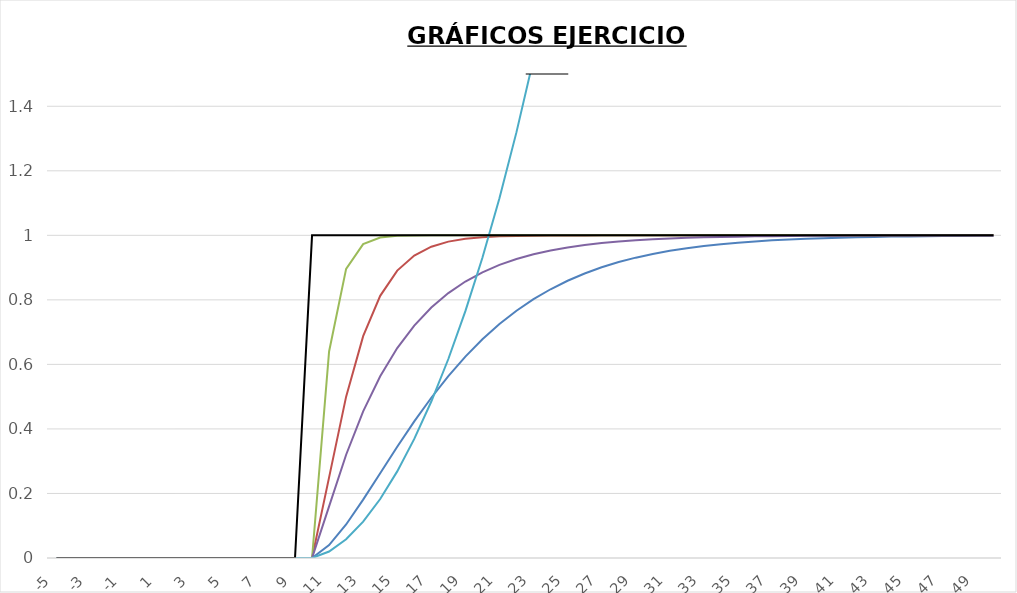
| Category | 1) | 2) | 3) | 4) | 5) | Series 5 |
|---|---|---|---|---|---|---|
| -5.0 | 0 | 0 | 0 | 0 | 0 | 0 |
| -4.0 | 0 | 0 | 0 | 0 | 0 | 0 |
| -3.0 | 0 | 0 | 0 | 0 | 0 | 0 |
| -2.0 | 0 | 0 | 0 | 0 | 0 | 0 |
| -1.0 | 0 | 0 | 0 | 0 | 0 | 0 |
| 0.0 | 0 | 0 | 0 | 0 | 0 | 0 |
| 1.0 | 0 | 0 | 0 | 0 | 0 | 0 |
| 2.0 | 0 | 0 | 0 | 0 | 0 | 0 |
| 3.0 | 0 | 0 | 0 | 0 | 0 | 0 |
| 4.0 | 0 | 0 | 0 | 0 | 0 | 0 |
| 5.0 | 0 | 0 | 0 | 0 | 0 | 0 |
| 6.0 | 0 | 0 | 0 | 0 | 0 | 0 |
| 7.0 | 0 | 0 | 0 | 0 | 0 | 0 |
| 8.0 | 0 | 0 | 0 | 0 | 0 | 0 |
| 9.0 | 0 | 0 | 0 | 0 | 0 | 0 |
| 10.0 | 0 | 0 | 0 | 0 | 0 | 1 |
| 11.0 | 0.04 | 0.25 | 0.64 | 0.16 | 0.02 | 1 |
| 12.0 | 0.104 | 0.5 | 0.896 | 0.32 | 0.058 | 1 |
| 13.0 | 0.181 | 0.688 | 0.973 | 0.454 | 0.113 | 1 |
| 14.0 | 0.263 | 0.812 | 0.993 | 0.563 | 0.183 | 1 |
| 15.0 | 0.345 | 0.891 | 0.998 | 0.65 | 0.268 | 1 |
| 16.0 | 0.423 | 0.938 | 1 | 0.72 | 0.369 | 1 |
| 17.0 | 0.497 | 0.965 | 1 | 0.776 | 0.485 | 1 |
| 18.0 | 0.564 | 0.98 | 1 | 0.821 | 0.617 | 1 |
| 19.0 | 0.624 | 0.989 | 1 | 0.857 | 0.765 | 1 |
| 20.0 | 0.678 | 0.994 | 1 | 0.885 | 0.931 | 1 |
| 21.0 | 0.725 | 0.997 | 1 | 0.908 | 1.115 | 1 |
| 22.0 | 0.766 | 0.998 | 1 | 0.927 | 1.32 | 1 |
| 23.0 | 0.802 | 0.999 | 1 | 0.941 | 1.546 | 1 |
| 24.0 | 0.833 | 1 | 1 | 0.953 | 1.797 | 1 |
| 25.0 | 0.859 | 1 | 1 | 0.962 | 2.073 | 1 |
| 26.0 | 0.882 | 1 | 1 | 0.97 | 2.377 | 1 |
| 27.0 | 0.901 | 1 | 1 | 0.976 | 2.713 | 1 |
| 28.0 | 0.917 | 1 | 1 | 0.981 | 3.082 | 1 |
| 29.0 | 0.931 | 1 | 1 | 0.985 | 3.489 | 1 |
| 30.0 | 0.942 | 1 | 1 | 0.988 | 3.937 | 1 |
| 31.0 | 0.952 | 1 | 1 | 0.99 | 4.429 | 1 |
| 32.0 | 0.96 | 1 | 1 | 0.992 | 4.972 | 1 |
| 33.0 | 0.967 | 1 | 1 | 0.994 | 5.568 | 1 |
| 34.0 | 0.973 | 1 | 1 | 0.995 | 6.224 | 1 |
| 35.0 | 0.977 | 1 | 1 | 0.996 | 6.946 | 1 |
| 36.0 | 0.981 | 1 | 1 | 0.997 | 7.741 | 1 |
| 37.0 | 0.985 | 1 | 1 | 0.997 | 8.615 | 1 |
| 38.0 | 0.987 | 1 | 1 | 0.998 | 9.576 | 1 |
| 39.0 | 0.989 | 1 | 1 | 0.998 | 10.633 | 1 |
| 40.0 | 0.991 | 1 | 1 | 0.999 | 11.797 | 1 |
| 41.0 | 0.993 | 1 | 1 | 0.999 | 13.076 | 1 |
| 42.0 | 0.994 | 1 | 1 | 0.999 | 14.484 | 1 |
| 43.0 | 0.995 | 1 | 1 | 0.999 | 16.032 | 1 |
| 44.0 | 0.996 | 1 | 1 | 0.999 | 17.735 | 1 |
| 45.0 | 0.997 | 1 | 1 | 1 | 19.609 | 1 |
| 46.0 | 0.997 | 1 | 1 | 1 | 21.669 | 1 |
| 47.0 | 0.998 | 1 | 1 | 1 | 23.936 | 1 |
| 48.0 | 0.998 | 1 | 1 | 1 | 26.43 | 1 |
| 49.0 | 0.999 | 1 | 1 | 1 | 29.173 | 1 |
| 50.0 | 0.999 | 1 | 1 | 1 | 32.19 | 1 |